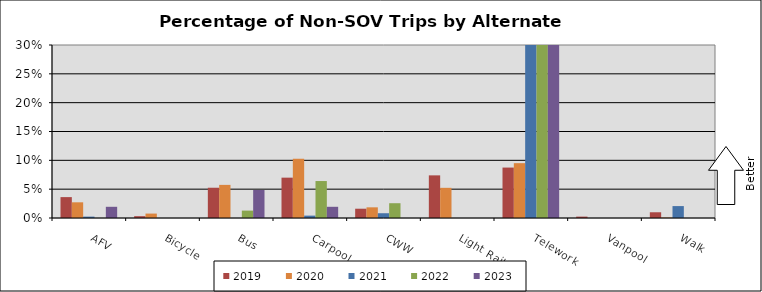
| Category | 2019 | 2020 | 2021 | 2022 | 2023 |
|---|---|---|---|---|---|
| AFV | 0.036 | 0.027 | 0.002 | 0 | 0.019 |
| Bicycle | 0.003 | 0.008 | 0 | 0 | 0 |
| Bus | 0.052 | 0.057 | 0 | 0.013 | 0.049 |
| Carpool | 0.07 | 0.103 | 0.004 | 0.064 | 0.019 |
| CWW | 0.016 | 0.019 | 0.008 | 0.026 | 0 |
| Light Rail | 0.074 | 0.052 | 0 | 0 | 0 |
| Telework | 0.087 | 0.095 | 0.826 | 0.641 | 0.728 |
| Vanpool | 0.002 | 0 | 0 | 0 | 0 |
| Walk | 0.01 | 0.001 | 0.021 | 0 | 0 |